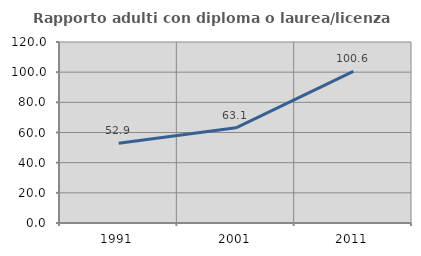
| Category | Rapporto adulti con diploma o laurea/licenza media  |
|---|---|
| 1991.0 | 52.866 |
| 2001.0 | 63.131 |
| 2011.0 | 100.562 |